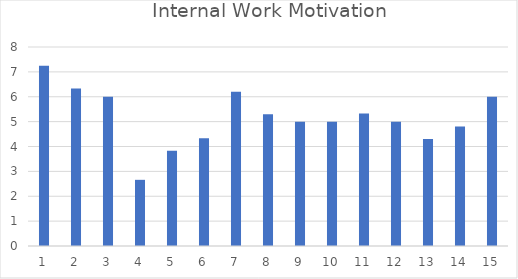
| Category | Internal Work Motivation |
|---|---|
| 0 | 7.25 |
| 1 | 6.33 |
| 2 | 6 |
| 3 | 2.66 |
| 4 | 3.83 |
| 5 | 4.33 |
| 6 | 6.2 |
| 7 | 5.3 |
| 8 | 5 |
| 9 | 5 |
| 10 | 5.33 |
| 11 | 5 |
| 12 | 4.3 |
| 13 | 4.8 |
| 14 | 6 |